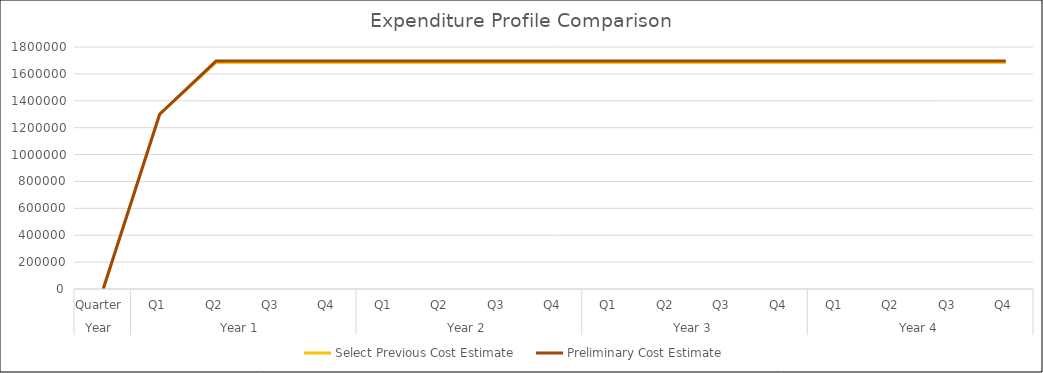
| Category | Select Previous Cost Estimate | Preliminary Cost Estimate |
|---|---|---|
| 0 | 0 | 0 |
| 1 | 1300000 | 1300000 |
| 2 | 1684867 | 1695174 |
| 3 | 1684867 | 1695174 |
| 4 | 1684867 | 1695174 |
| 5 | 1684867 | 1695174 |
| 6 | 1684867 | 1695174 |
| 7 | 1684867 | 1695174 |
| 8 | 1684867 | 1695174 |
| 9 | 1684867 | 1695174 |
| 10 | 1684867 | 1695174 |
| 11 | 1684867 | 1695174 |
| 12 | 1684867 | 1695174 |
| 13 | 1684867 | 1695174 |
| 14 | 1684867 | 1695174 |
| 15 | 1684867 | 1695174 |
| 16 | 1684867 | 1695174 |